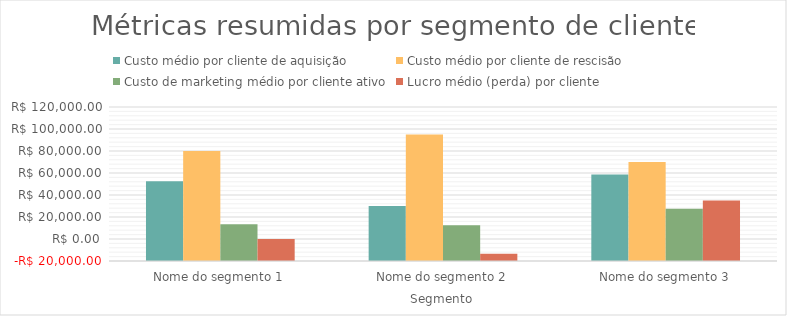
| Category | Custo médio por cliente de aquisição | Custo médio por cliente de rescisão | Custo de marketing médio por cliente ativo | Lucro médio (perda) por cliente |
|---|---|---|---|---|
| Nome do segmento 1 | 52500 | 80000 | 13333.333 | 0 |
| Nome do segmento 2 | 30000 | 95000 | 12500 | -13500 |
| Nome do segmento 3 | 58750 | 70000 | 27500 | 35000 |